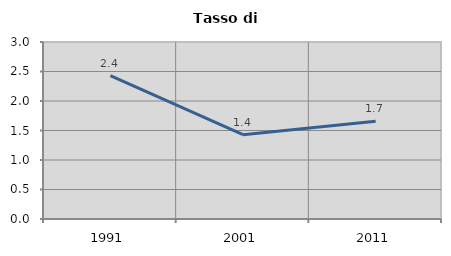
| Category | Tasso di disoccupazione   |
|---|---|
| 1991.0 | 2.429 |
| 2001.0 | 1.429 |
| 2011.0 | 1.659 |